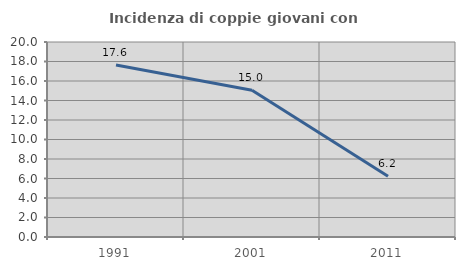
| Category | Incidenza di coppie giovani con figli |
|---|---|
| 1991.0 | 17.647 |
| 2001.0 | 15.049 |
| 2011.0 | 6.224 |